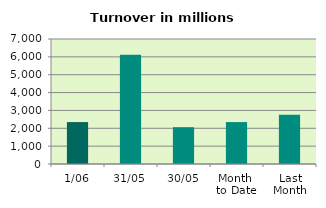
| Category | Series 0 |
|---|---|
| 1/06 | 2348.119 |
| 31/05 | 6115.224 |
| 30/05 | 2060.955 |
| Month 
to Date | 2348.119 |
| Last
Month | 2758.944 |